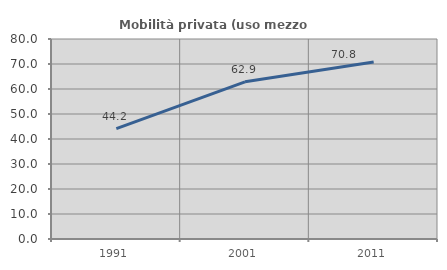
| Category | Mobilità privata (uso mezzo privato) |
|---|---|
| 1991.0 | 44.181 |
| 2001.0 | 62.885 |
| 2011.0 | 70.833 |